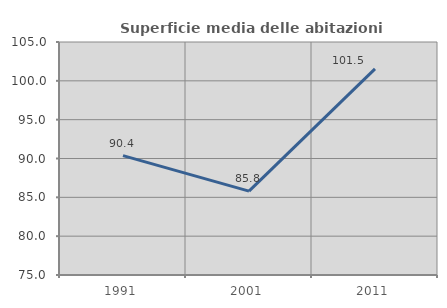
| Category | Superficie media delle abitazioni occupate |
|---|---|
| 1991.0 | 90.374 |
| 2001.0 | 85.799 |
| 2011.0 | 101.53 |